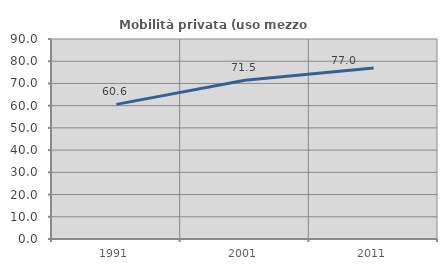
| Category | Mobilità privata (uso mezzo privato) |
|---|---|
| 1991.0 | 60.57 |
| 2001.0 | 71.475 |
| 2011.0 | 76.955 |